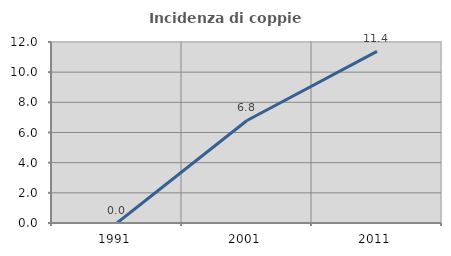
| Category | Incidenza di coppie miste |
|---|---|
| 1991.0 | 0 |
| 2001.0 | 6.796 |
| 2011.0 | 11.382 |